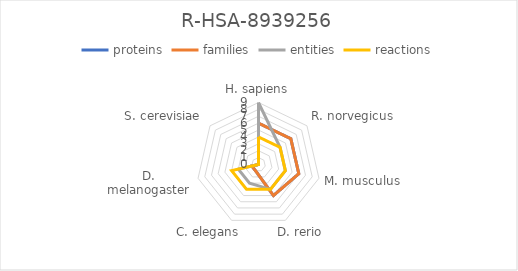
| Category | proteins | families | entities | reactions |
|---|---|---|---|---|
| H. sapiens | 6 | 6 | 9 | 4 |
| R. norvegicus | 6 | 6 | 4 | 4 |
| M. musculus | 6 | 6 | 4 | 4 |
| D. rerio | 5 | 5 | 4 | 4 |
| C. elegans | 1 | 1 | 3 | 4 |
| D. melanogaster | 1 | 1 | 3 | 4 |
| S. cerevisiae | 0 | 0 | 0 | 0 |